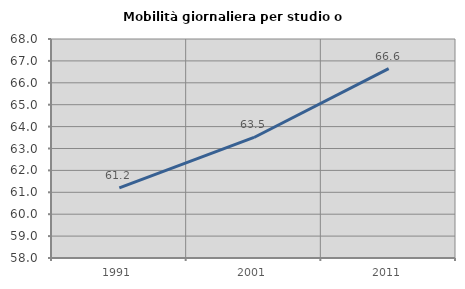
| Category | Mobilità giornaliera per studio o lavoro |
|---|---|
| 1991.0 | 61.199 |
| 2001.0 | 63.504 |
| 2011.0 | 66.645 |